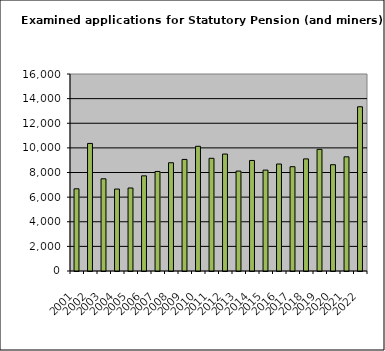
| Category | Series 0 |
|---|---|
| 2001.0 | 6676 |
| 2002.0 | 10360 |
| 2003.0 | 7488 |
| 2004.0 | 6656 |
| 2005.0 | 6741 |
| 2006.0 | 7728 |
| 2007.0 | 8085 |
| 2008.0 | 8792 |
| 2009.0 | 9063 |
| 2010.0 | 10129 |
| 2011.0 | 9153 |
| 2012.0 | 9498 |
| 2013.0 | 8115 |
| 2014.0 | 8978 |
| 2015.0 | 8194 |
| 2016.0 | 8689 |
| 2017.0 | 8470 |
| 2018.0 | 9105 |
| 2019.0 | 9881 |
| 2020.0 | 8633 |
| 2021.0 | 9273 |
| 2022.0 | 13340 |